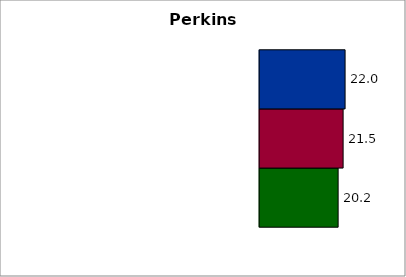
| Category | State | SREB states | 50 states and D.C. |
|---|---|---|---|
| 0 | 20.235 | 21.52 | 22.03 |